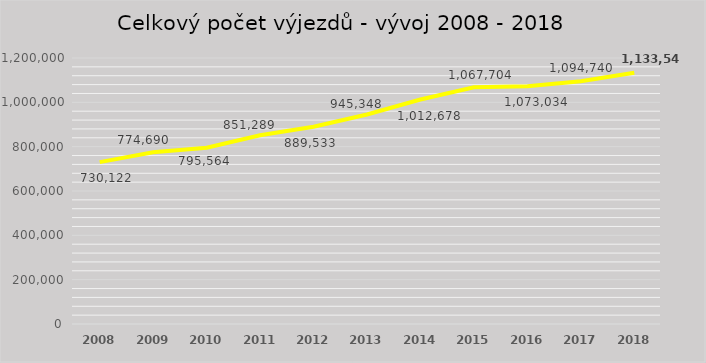
| Category | Celkový počet výjezdů  |
|---|---|
| 2008.0 | 730122 |
| 2009.0 | 774690 |
| 2010.0 | 795564 |
| 2011.0 | 851289 |
| 2012.0 | 889533 |
| 2013.0 | 945348 |
| 2014.0 | 1012678 |
| 2015.0 | 1067704 |
| 2016.0 | 1073034 |
| 2017.0 | 1094740 |
| 2018.0 | 1133549 |